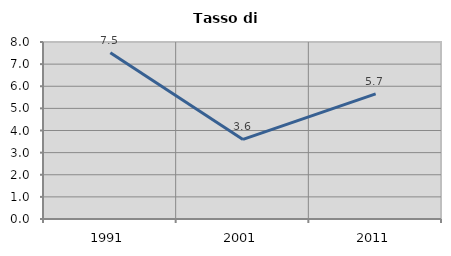
| Category | Tasso di disoccupazione   |
|---|---|
| 1991.0 | 7.511 |
| 2001.0 | 3.595 |
| 2011.0 | 5.656 |